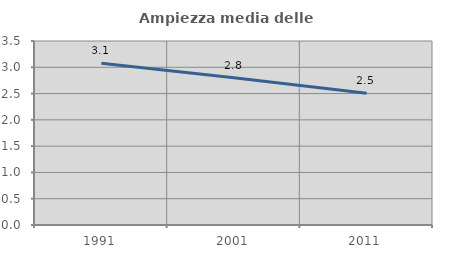
| Category | Ampiezza media delle famiglie |
|---|---|
| 1991.0 | 3.077 |
| 2001.0 | 2.801 |
| 2011.0 | 2.504 |